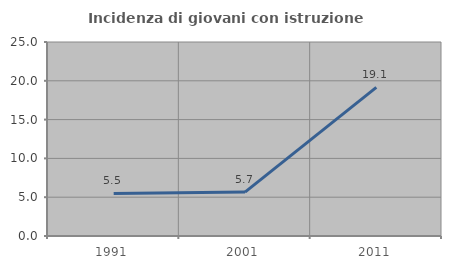
| Category | Incidenza di giovani con istruzione universitaria |
|---|---|
| 1991.0 | 5.479 |
| 2001.0 | 5.66 |
| 2011.0 | 19.149 |